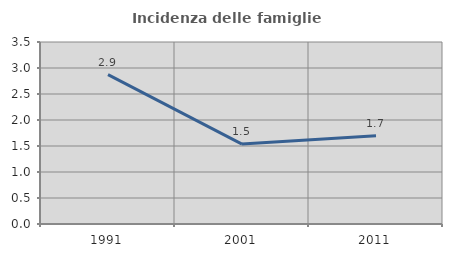
| Category | Incidenza delle famiglie numerose |
|---|---|
| 1991.0 | 2.871 |
| 2001.0 | 1.537 |
| 2011.0 | 1.698 |